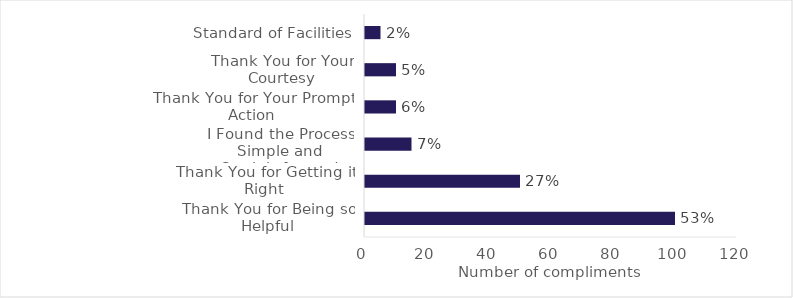
| Category | Series 0 |
|---|---|
| Thank You for Being so Helpful | 100 |
| Thank You for Getting it Right | 50 |
| I Found the Process Simple and Straightforward | 15 |
| Thank You for Your Prompt Action | 10 |
| Thank You for Your Courtesy | 10 |
| Standard of Facilities | 5 |